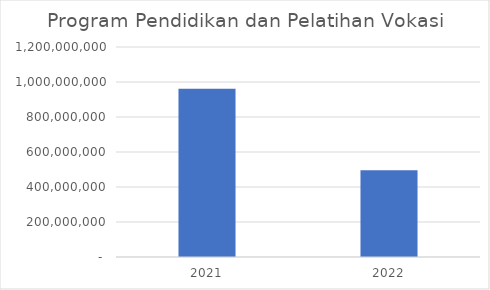
| Category | Program Pendidikan dan Pelatihan Vokasi |
|---|---|
| 2021.0 | 962024611 |
| 2022.0 | 495895777 |